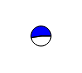
| Category | Series 0 |
|---|---|
| 0 | 3086481 |
| 1 | 3431187 |